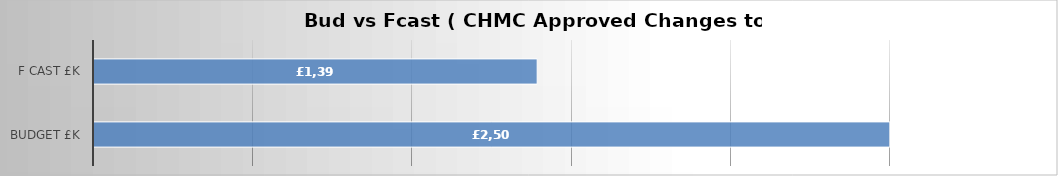
| Category | Series 0 |
|---|---|
| Budget £k | 2500 |
| F cast £k | 1392.186 |